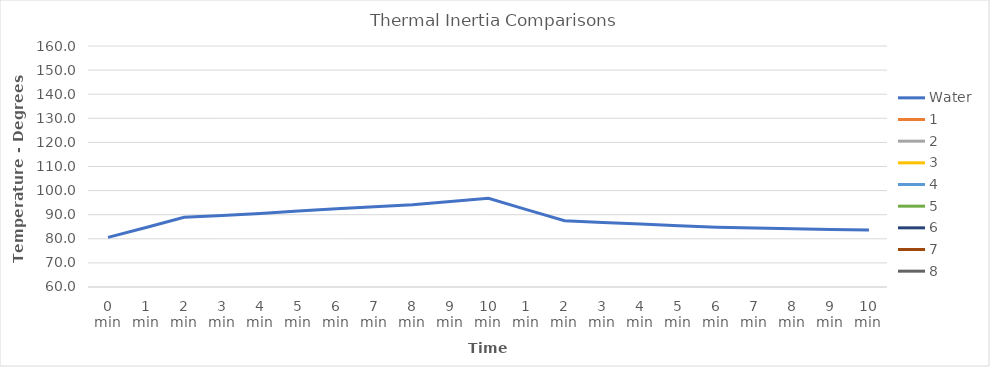
| Category | Water | 1 | 2 | 3 | 4 | 5 | 6 | 7 | 8 |
|---|---|---|---|---|---|---|---|---|---|
| 0 min | 80.6 |  |  |  |  |  |  |  |  |
| 1 min | 84.7 |  |  |  |  |  |  |  |  |
| 2 min | 88.9 |  |  |  |  |  |  |  |  |
| 3 min | 89.7 |  |  |  |  |  |  |  |  |
| 4 min | 90.5 |  |  |  |  |  |  |  |  |
| 5 min | 91.5 |  |  |  |  |  |  |  |  |
| 6 min | 92.5 |  |  |  |  |  |  |  |  |
| 7 min | 93.3 |  |  |  |  |  |  |  |  |
| 8 min | 94.1 |  |  |  |  |  |  |  |  |
| 9 min | 95.5 |  |  |  |  |  |  |  |  |
| 10 min | 96.8 |  |  |  |  |  |  |  |  |
| 1 min | 92.1 |  |  |  |  |  |  |  |  |
| 2 min | 87.5 |  |  |  |  |  |  |  |  |
| 3 min | 86.8 |  |  |  |  |  |  |  |  |
| 4 min | 86.1 |  |  |  |  |  |  |  |  |
| 5 min | 85.4 |  |  |  |  |  |  |  |  |
| 6 min | 84.8 |  |  |  |  |  |  |  |  |
| 7 min | 84.5 |  |  |  |  |  |  |  |  |
| 8 min | 84.2 |  |  |  |  |  |  |  |  |
| 9 min | 83.9 |  |  |  |  |  |  |  |  |
| 10 min | 83.7 |  |  |  |  |  |  |  |  |